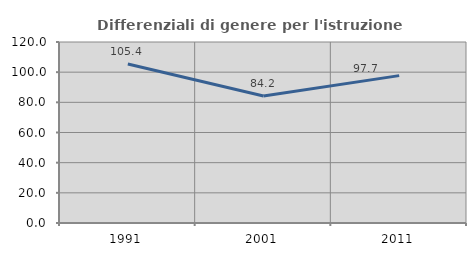
| Category | Differenziali di genere per l'istruzione superiore |
|---|---|
| 1991.0 | 105.393 |
| 2001.0 | 84.247 |
| 2011.0 | 97.703 |